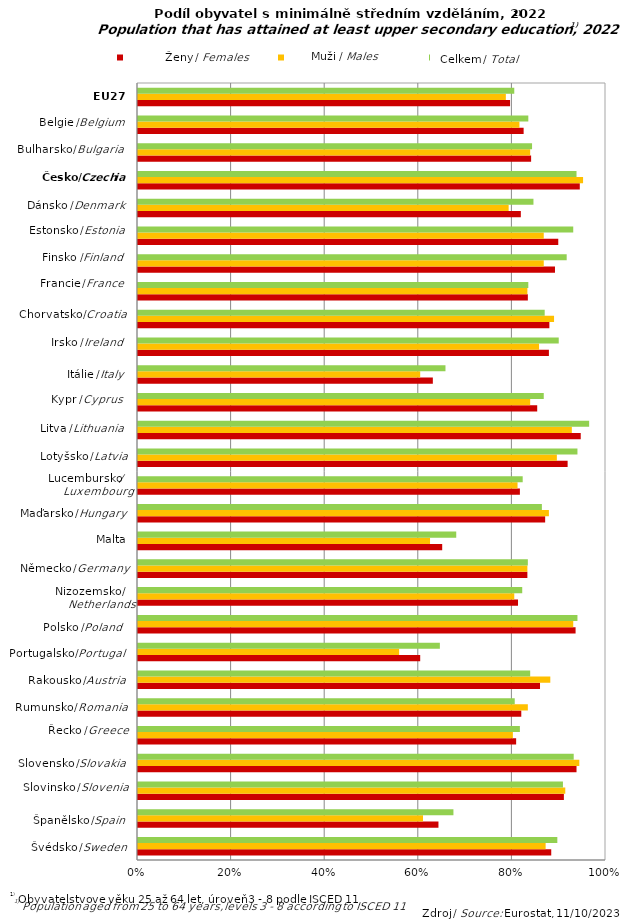
| Category | Celkem / Total | Muži / Males | Ženy / Females |
|---|---|---|---|
| Sweden | 0.883 | 0.871 | 0.896 |
| Spain | 0.642 | 0.609 | 0.674 |
| Slovenia | 0.91 | 0.913 | 0.908 |
| Slovakia | 0.937 | 0.943 | 0.931 |
| Greece | 0.808 | 0.801 | 0.816 |
| Romania | 0.819 | 0.833 | 0.805 |
| Austria | 0.859 | 0.881 | 0.838 |
| Portugal | 0.603 | 0.558 | 0.645 |
| Poland | 0.935 | 0.93 | 0.939 |
| Netherlands | 0.812 | 0.804 | 0.821 |
| Germany | 0.832 | 0.832 | 0.833 |
| Malta | 0.65 | 0.624 | 0.68 |
| Hungary | 0.87 | 0.878 | 0.863 |
| Luxembourg | 0.816 | 0.811 | 0.822 |
| Latvia | 0.918 | 0.895 | 0.939 |
| Lithuania | 0.946 | 0.927 | 0.964 |
| Cyprus | 0.853 | 0.838 | 0.867 |
| Italy | 0.63 | 0.603 | 0.657 |
| Ireland | 0.878 | 0.857 | 0.899 |
| Croatia | 0.879 | 0.889 | 0.869 |
| France | 0.833 | 0.832 | 0.834 |
| Finland | 0.891 | 0.867 | 0.916 |
| Estonia | 0.898 | 0.867 | 0.93 |
| Denmark | 0.818 | 0.792 | 0.845 |
| Czechia | 0.944 | 0.951 | 0.937 |
| Bulgaria | 0.84 | 0.838 | 0.842 |
| Belgium | 0.824 | 0.815 | 0.834 |
| EU 27 | 0.795 | 0.786 | 0.804 |